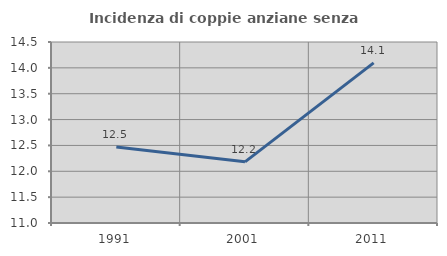
| Category | Incidenza di coppie anziane senza figli  |
|---|---|
| 1991.0 | 12.469 |
| 2001.0 | 12.183 |
| 2011.0 | 14.096 |